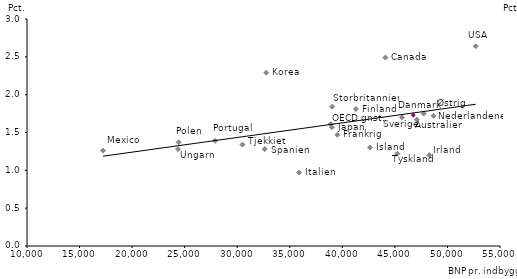
| Category | Series 0 |
|---|---|
| 35885.0 | 0.97 |
| 48273.0 | 1.2 |
| 45232.0 | 1.22 |
| 17225.0 | 1.26 |
| 32621.0 | 1.28 |
| 24366.0 | 1.28 |
| 42632.0 | 1.3 |
| 30496.0 | 1.34 |
| 24422.0 | 1.37 |
| 27899.0 | 1.39 |
| 39531.0 | 1.47 |
| 39008.0 | 1.57 |
| 38896.0 | 1.61 |
| 47086.0 | 1.67 |
| 45673.0 | 1.7 |
| 48679.0 | 1.72 |
| 46743.0 | 1.73 |
| 47734.0 | 1.75 |
| 41293.0 | 1.81 |
| 39030.0 | 1.84 |
| 32751.0 | 2.29 |
| 44098.0 | 2.49 |
| 52689.0 | 2.64 |